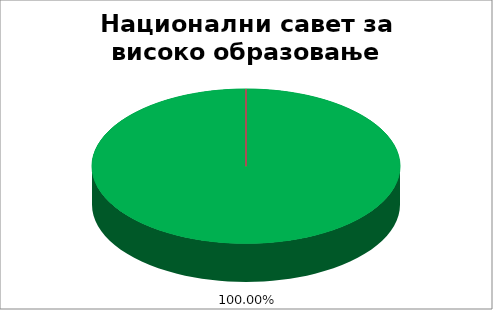
| Category | Национални савет за високо образовање |
|---|---|
| 0 | 1 |
| 1 | 0 |
| 2 | 0 |
| 3 | 0 |
| 4 | 0 |